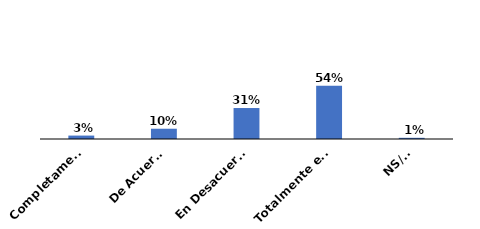
| Category | Series 0 |
|---|---|
| Completamente de acuerdo | 0.035 |
| De Acuerdo | 0.104 |
| En Desacuerdo | 0.313 |
| Totalmente en desacuerdo | 0.537 |
| NS/NR | 0.012 |